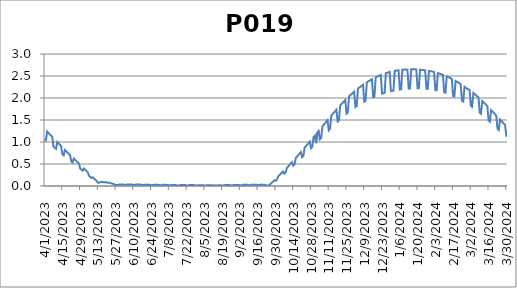
| Category | P019 |
|---|---|
| 4/1/23 | 1.07 |
| 4/2/23 | 1.043 |
| 4/3/23 | 1.239 |
| 4/4/23 | 1.207 |
| 4/5/23 | 1.177 |
| 4/6/23 | 1.147 |
| 4/7/23 | 1.118 |
| 4/8/23 | 0.894 |
| 4/9/23 | 0.869 |
| 4/10/23 | 0.844 |
| 4/11/23 | 1 |
| 4/12/23 | 0.969 |
| 4/13/23 | 0.939 |
| 4/14/23 | 0.909 |
| 4/15/23 | 0.721 |
| 4/16/23 | 0.697 |
| 4/17/23 | 0.821 |
| 4/18/23 | 0.793 |
| 4/19/23 | 0.763 |
| 4/20/23 | 0.735 |
| 4/21/23 | 0.706 |
| 4/22/23 | 0.558 |
| 4/23/23 | 0.535 |
| 4/24/23 | 0.623 |
| 4/25/23 | 0.595 |
| 4/26/23 | 0.566 |
| 4/27/23 | 0.538 |
| 4/28/23 | 0.511 |
| 4/29/23 | 0.397 |
| 4/30/23 | 0.373 |
| 5/1/23 | 0.348 |
| 5/2/23 | 0.396 |
| 5/3/23 | 0.37 |
| 5/4/23 | 0.34 |
| 5/5/23 | 0.311 |
| 5/6/23 | 0.23 |
| 5/7/23 | 0.206 |
| 5/8/23 | 0.182 |
| 5/9/23 | 0.198 |
| 5/10/23 | 0.17 |
| 5/11/23 | 0.142 |
| 5/12/23 | 0.117 |
| 5/13/23 | 0.074 |
| 5/14/23 | 0.075 |
| 5/15/23 | 0.089 |
| 5/16/23 | 0.09 |
| 5/17/23 | 0.091 |
| 5/18/23 | 0.078 |
| 5/19/23 | 0.091 |
| 5/20/23 | 0.078 |
| 5/21/23 | 0.072 |
| 5/22/23 | 0.076 |
| 5/23/23 | 0.066 |
| 5/24/23 | 0.057 |
| 5/25/23 | 0.048 |
| 5/26/23 | 0.039 |
| 5/27/23 | 0.025 |
| 5/28/23 | 0.025 |
| 5/29/23 | 0.025 |
| 5/30/23 | 0.036 |
| 5/31/23 | 0.036 |
| 6/1/23 | 0.036 |
| 6/2/23 | 0.036 |
| 6/3/23 | 0.024 |
| 6/4/23 | 0.024 |
| 6/5/23 | 0.035 |
| 6/6/23 | 0.035 |
| 6/7/23 | 0.034 |
| 6/8/23 | 0.034 |
| 6/9/23 | 0.034 |
| 6/10/23 | 0.023 |
| 6/11/23 | 0.022 |
| 6/12/23 | 0.033 |
| 6/13/23 | 0.033 |
| 6/14/23 | 0.033 |
| 6/15/23 | 0.033 |
| 6/16/23 | 0.032 |
| 6/17/23 | 0.021 |
| 6/18/23 | 0.021 |
| 6/19/23 | 0.031 |
| 6/20/23 | 0.031 |
| 6/21/23 | 0.03 |
| 6/22/23 | 0.03 |
| 6/23/23 | 0.03 |
| 6/24/23 | 0.019 |
| 6/25/23 | 0.019 |
| 6/26/23 | 0.029 |
| 6/27/23 | 0.028 |
| 6/28/23 | 0.028 |
| 6/29/23 | 0.028 |
| 6/30/23 | 0.027 |
| 7/1/23 | 0.017 |
| 7/2/23 | 0.017 |
| 7/3/23 | 0.026 |
| 7/4/23 | 0.026 |
| 7/5/23 | 0.026 |
| 7/6/23 | 0.025 |
| 7/7/23 | 0.025 |
| 7/8/23 | 0.015 |
| 7/9/23 | 0.015 |
| 7/10/23 | 0.024 |
| 7/11/23 | 0.024 |
| 7/12/23 | 0.024 |
| 7/13/23 | 0.023 |
| 7/14/23 | 0.014 |
| 7/15/23 | 0.014 |
| 7/16/23 | 0.013 |
| 7/17/23 | 0.022 |
| 7/18/23 | 0.022 |
| 7/19/23 | 0.022 |
| 7/20/23 | 0.022 |
| 7/21/23 | 0.021 |
| 7/22/23 | 0.012 |
| 7/23/23 | 0.012 |
| 7/24/23 | 0.021 |
| 7/25/23 | 0.021 |
| 7/26/23 | 0.02 |
| 7/27/23 | 0.02 |
| 7/28/23 | 0.02 |
| 7/29/23 | 0.011 |
| 7/30/23 | 0.011 |
| 7/31/23 | 0.02 |
| 8/1/23 | 0.019 |
| 8/2/23 | 0.019 |
| 8/3/23 | 0.019 |
| 8/4/23 | 0.019 |
| 8/5/23 | 0.01 |
| 8/6/23 | 0.01 |
| 8/7/23 | 0.019 |
| 8/8/23 | 0.018 |
| 8/9/23 | 0.018 |
| 8/10/23 | 0.018 |
| 8/11/23 | 0.018 |
| 8/12/23 | 0.009 |
| 8/13/23 | 0.009 |
| 8/14/23 | 0.018 |
| 8/15/23 | 0.009 |
| 8/16/23 | 0.018 |
| 8/17/23 | 0.018 |
| 8/18/23 | 0.019 |
| 8/19/23 | 0.01 |
| 8/20/23 | 0.01 |
| 8/21/23 | 0.02 |
| 8/22/23 | 0.02 |
| 8/23/23 | 0.021 |
| 8/24/23 | 0.021 |
| 8/25/23 | 0.021 |
| 8/26/23 | 0.013 |
| 8/27/23 | 0.013 |
| 8/28/23 | 0.023 |
| 8/29/23 | 0.023 |
| 8/30/23 | 0.024 |
| 8/31/23 | 0.024 |
| 9/1/23 | 0.024 |
| 9/2/23 | 0.015 |
| 9/3/23 | 0.015 |
| 9/4/23 | 0.025 |
| 9/5/23 | 0.026 |
| 9/6/23 | 0.026 |
| 9/7/23 | 0.027 |
| 9/8/23 | 0.027 |
| 9/9/23 | 0.018 |
| 9/10/23 | 0.018 |
| 9/11/23 | 0.029 |
| 9/12/23 | 0.029 |
| 9/13/23 | 0.03 |
| 9/14/23 | 0.03 |
| 9/15/23 | 0.031 |
| 9/16/23 | 0.021 |
| 9/17/23 | 0.021 |
| 9/18/23 | 0.031 |
| 9/19/23 | 0.031 |
| 9/20/23 | 0.029 |
| 9/21/23 | 0.027 |
| 9/22/23 | 0.025 |
| 9/23/23 | 0.012 |
| 9/24/23 | 0.009 |
| 9/25/23 | 0.018 |
| 9/26/23 | 0.046 |
| 9/27/23 | 0.072 |
| 9/28/23 | 0.103 |
| 9/29/23 | 0.13 |
| 9/30/23 | 0.116 |
| 10/1/23 | 0.141 |
| 10/2/23 | 0.215 |
| 10/3/23 | 0.245 |
| 10/4/23 | 0.272 |
| 10/5/23 | 0.3 |
| 10/6/23 | 0.329 |
| 10/7/23 | 0.28 |
| 10/8/23 | 0.304 |
| 10/9/23 | 0.415 |
| 10/10/23 | 0.443 |
| 10/11/23 | 0.475 |
| 10/12/23 | 0.506 |
| 10/13/23 | 0.54 |
| 10/14/23 | 0.462 |
| 10/15/23 | 0.489 |
| 10/16/23 | 0.638 |
| 10/17/23 | 0.67 |
| 10/18/23 | 0.703 |
| 10/19/23 | 0.738 |
| 10/20/23 | 0.771 |
| 10/21/23 | 0.657 |
| 10/22/23 | 0.686 |
| 10/23/23 | 0.874 |
| 10/24/23 | 0.906 |
| 10/25/23 | 0.939 |
| 10/26/23 | 0.973 |
| 10/27/23 | 1.009 |
| 10/28/23 | 0.857 |
| 10/29/23 | 0.887 |
| 10/30/23 | 1.111 |
| 10/31/23 | 1.146 |
| 11/1/23 | 0.974 |
| 11/2/23 | 1.216 |
| 11/3/23 | 1.252 |
| 11/4/23 | 1.062 |
| 11/5/23 | 1.093 |
| 11/6/23 | 1.355 |
| 11/7/23 | 1.39 |
| 11/8/23 | 1.426 |
| 11/9/23 | 1.461 |
| 11/10/23 | 1.496 |
| 11/11/23 | 1.266 |
| 11/12/23 | 1.296 |
| 11/13/23 | 1.599 |
| 11/14/23 | 1.633 |
| 11/15/23 | 1.667 |
| 11/16/23 | 1.7 |
| 11/17/23 | 1.734 |
| 11/18/23 | 1.466 |
| 11/19/23 | 1.493 |
| 11/20/23 | 1.832 |
| 11/21/23 | 1.862 |
| 11/22/23 | 1.893 |
| 11/23/23 | 1.924 |
| 11/24/23 | 1.954 |
| 11/25/23 | 1.644 |
| 11/26/23 | 1.667 |
| 11/27/23 | 2.04 |
| 11/28/23 | 2.066 |
| 11/29/23 | 2.091 |
| 11/30/23 | 2.117 |
| 12/1/23 | 2.143 |
| 12/2/23 | 1.795 |
| 12/3/23 | 1.816 |
| 12/4/23 | 2.216 |
| 12/5/23 | 2.237 |
| 12/6/23 | 2.256 |
| 12/7/23 | 2.278 |
| 12/8/23 | 2.3 |
| 12/9/23 | 1.918 |
| 12/10/23 | 1.933 |
| 12/11/23 | 2.357 |
| 12/12/23 | 2.375 |
| 12/13/23 | 2.391 |
| 12/14/23 | 2.408 |
| 12/15/23 | 2.428 |
| 12/16/23 | 2.019 |
| 12/17/23 | 2.034 |
| 12/18/23 | 2.472 |
| 12/19/23 | 2.486 |
| 12/20/23 | 2.496 |
| 12/21/23 | 2.511 |
| 12/22/23 | 2.524 |
| 12/23/23 | 2.1 |
| 12/24/23 | 2.109 |
| 12/25/23 | 2.117 |
| 12/26/23 | 2.565 |
| 12/27/23 | 2.574 |
| 12/28/23 | 2.582 |
| 12/29/23 | 2.591 |
| 12/30/23 | 2.157 |
| 12/31/23 | 2.161 |
| 1/1/24 | 2.168 |
| 1/2/24 | 2.615 |
| 1/3/24 | 2.622 |
| 1/4/24 | 2.626 |
| 1/5/24 | 2.631 |
| 1/6/24 | 2.191 |
| 1/7/24 | 2.197 |
| 1/8/24 | 2.641 |
| 1/9/24 | 2.643 |
| 1/10/24 | 2.645 |
| 1/11/24 | 2.647 |
| 1/12/24 | 2.649 |
| 1/13/24 | 2.214 |
| 1/14/24 | 2.215 |
| 1/15/24 | 2.652 |
| 1/16/24 | 2.651 |
| 1/17/24 | 2.651 |
| 1/18/24 | 2.651 |
| 1/19/24 | 2.648 |
| 1/20/24 | 2.219 |
| 1/21/24 | 2.22 |
| 1/22/24 | 2.643 |
| 1/23/24 | 2.641 |
| 1/24/24 | 2.638 |
| 1/25/24 | 2.633 |
| 1/26/24 | 2.629 |
| 1/27/24 | 2.211 |
| 1/28/24 | 2.208 |
| 1/29/24 | 2.615 |
| 1/30/24 | 2.611 |
| 1/31/24 | 2.606 |
| 2/1/24 | 2.598 |
| 2/2/24 | 2.589 |
| 2/3/24 | 2.18 |
| 2/4/24 | 2.175 |
| 2/5/24 | 2.565 |
| 2/6/24 | 2.557 |
| 2/7/24 | 2.549 |
| 2/8/24 | 2.538 |
| 2/9/24 | 2.525 |
| 2/10/24 | 2.128 |
| 2/11/24 | 2.119 |
| 2/12/24 | 2.49 |
| 2/13/24 | 2.477 |
| 2/14/24 | 2.466 |
| 2/15/24 | 2.451 |
| 2/16/24 | 2.435 |
| 2/17/24 | 2.047 |
| 2/18/24 | 2.034 |
| 2/19/24 | 2.386 |
| 2/20/24 | 2.37 |
| 2/21/24 | 2.354 |
| 2/22/24 | 2.334 |
| 2/23/24 | 2.313 |
| 2/24/24 | 1.938 |
| 2/25/24 | 1.921 |
| 2/26/24 | 2.254 |
| 2/27/24 | 2.233 |
| 2/28/24 | 2.211 |
| 2/29/24 | 2.198 |
| 3/1/24 | 2.186 |
| 3/2/24 | 1.825 |
| 3/3/24 | 1.802 |
| 3/4/24 | 2.116 |
| 3/5/24 | 2.09 |
| 3/6/24 | 2.067 |
| 3/7/24 | 2.039 |
| 3/8/24 | 2.012 |
| 3/9/24 | 1.664 |
| 3/10/24 | 1.641 |
| 3/11/24 | 1.93 |
| 3/12/24 | 1.905 |
| 3/13/24 | 1.875 |
| 3/14/24 | 1.845 |
| 3/15/24 | 1.815 |
| 3/16/24 | 1.489 |
| 3/17/24 | 1.463 |
| 3/18/24 | 1.725 |
| 3/19/24 | 1.694 |
| 3/20/24 | 1.666 |
| 3/21/24 | 1.634 |
| 3/22/24 | 1.603 |
| 3/23/24 | 1.304 |
| 3/24/24 | 1.275 |
| 3/25/24 | 1.511 |
| 3/26/24 | 1.48 |
| 3/27/24 | 1.45 |
| 3/28/24 | 1.419 |
| 3/29/24 | 1.388 |
| 3/30/24 | 1.121 |